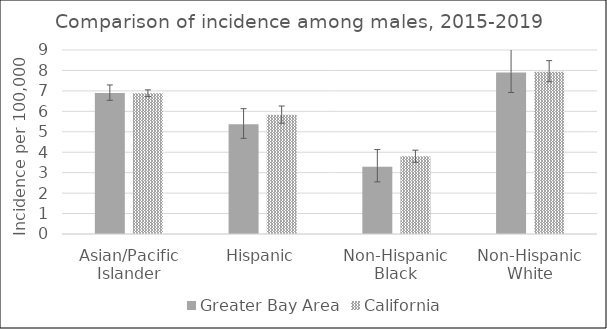
| Category | Greater Bay Area | California | SEER 18 |
|---|---|---|---|
| Asian/Pacific Islander | 6.9 | 6.88 |  |
| Hispanic | 5.37 | 5.83 |  |
| Non-Hispanic Black | 3.29 | 3.8 |  |
| Non-Hispanic White | 7.9 | 7.94 |  |